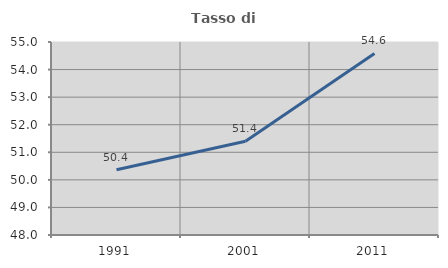
| Category | Tasso di occupazione   |
|---|---|
| 1991.0 | 50.368 |
| 2001.0 | 51.4 |
| 2011.0 | 54.585 |